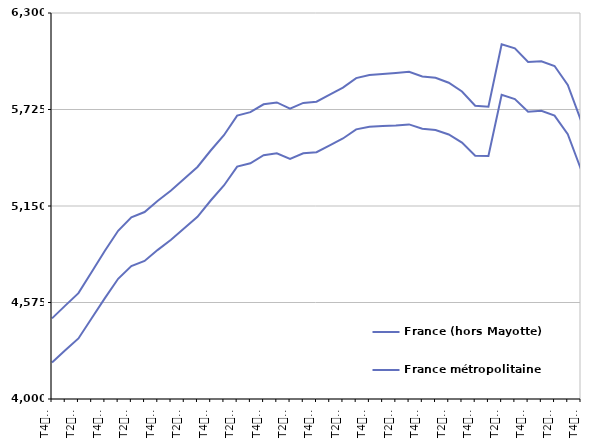
| Category | France (hors Mayotte) | France métropolitaine |
|---|---|---|
| T4
2011 | 4480.5 | 4217.6 |
| T1
2012 | 4556.5 | 4290.3 |
| T2
2012 | 4630.7 | 4360.7 |
| T3
2012 | 4756.3 | 4480.8 |
| T4
2012 | 4883 | 4600.9 |
| T1
2013 | 5002.2 | 4716.3 |
| T2
2013 | 5082.7 | 4791.9 |
| T3
2013 | 5114 | 4822.9 |
| T4
2013 | 5181.5 | 4888.7 |
| T1
2014 | 5242 | 4948.8 |
| T2
2014 | 5312.3 | 5017.1 |
| T3
2014 | 5382.6 | 5085.7 |
| T4
2014 | 5480.7 | 5182.8 |
| T1
2015 | 5571.7 | 5272.2 |
| T2
2015 | 5688.4 | 5384.8 |
| T3
2015 | 5709 | 5404.8 |
| T4
2015 | 5755.8 | 5452.5 |
| T1
2016 | 5767.1 | 5464 |
| T2
2016 | 5730 | 5430.7 |
| T3
2016 | 5764.3 | 5464.3 |
| T4
2016 | 5771.7 | 5470.4 |
| T1
2017 | 5813.4 | 5511.3 |
| T2
2017 | 5855.1 | 5552.5 |
| T3
2017 | 5911.8 | 5606.6 |
| T4
2017 | 5931 | 5622.8 |
| T1
2018 | 5936.5 | 5626.6 |
| T2
2018 | 5942.3 | 5629.4 |
| T3
2018 | 5949.2 | 5636.1 |
| T4
2018 | 5922.2 | 5610.7 |
| T1
2019 | 5914.3 | 5603.1 |
| T2
2019 | 5884.6 | 5576.3 |
| T3
2019 | 5832.2 | 5527.4 |
| T4
2019 | 5747.1 | 5449.2 |
| T1
2020 | 5742 | 5448.2 |
| T2
2020 | 6113.9 | 5813.3 |
| T3
2020 | 6089.3 | 5787.1 |
| T4
2020 | 6008.4 | 5712.2 |
| T1
2021 | 6012.6 | 5716.9 |
| T2
2021 | 5984 | 5688.7 |
| T3
2021 | 5871.2 | 5577.8 |
| T4
2021 | 5658.9 | 5368.2 |